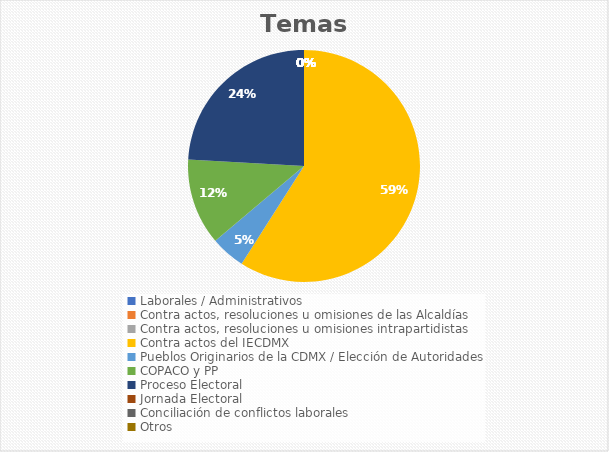
| Category | Temas |
|---|---|
| Laborales / Administrativos | 0 |
| Contra actos, resoluciones u omisiones de las Alcaldías | 0 |
| Contra actos, resoluciones u omisiones intrapartidistas | 0 |
| Contra actos del IECDMX | 49 |
| Pueblos Originarios de la CDMX / Elección de Autoridades | 4 |
| COPACO y PP | 10 |
| Proceso Electoral | 20 |
| Jornada Electoral | 0 |
| Conciliación de conflictos laborales | 0 |
| Otros | 0 |